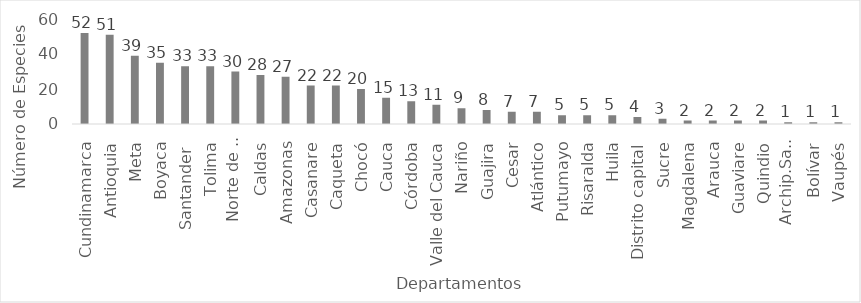
| Category | Especies  |
|---|---|
| Cundinamarca | 52 |
| Antioquia | 51 |
| Meta | 39 |
| Boyaca | 35 |
| Santander  | 33 |
| Tolima | 33 |
| Norte de Santander | 30 |
| Caldas | 28 |
| Amazonas | 27 |
| Casanare | 22 |
| Caqueta | 22 |
| Chocó | 20 |
| Cauca | 15 |
| Córdoba | 13 |
| Valle del Cauca | 11 |
| Nariño | 9 |
| Guajira | 8 |
| Cesar | 7 |
| Atlántico | 7 |
| Putumayo | 5 |
| Risaralda | 5 |
| Huila | 5 |
| Distrito capital | 4 |
| Sucre | 3 |
| Magdalena | 2 |
| Arauca | 2 |
| Guaviare | 2 |
| Quindio | 2 |
| Archip.San Andrés | 1 |
| Bolívar | 1 |
| Vaupés | 1 |